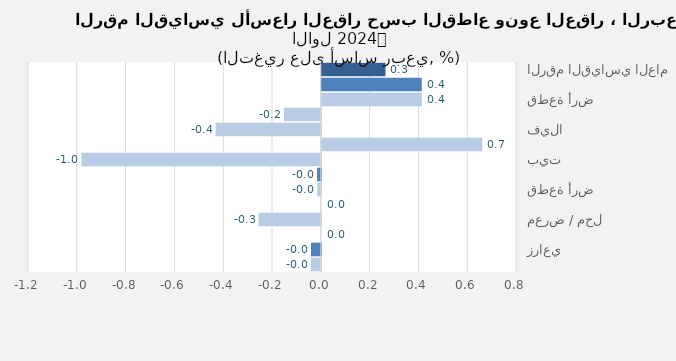
| Category | Series 0 |
|---|---|
| الرقم القياسي العام | 0.261 |
| سكني | 0.41 |
| قطعة أرض | 0.41 |
| عمارة | -0.151 |
| فيلا | -0.431 |
| شقة | 0.658 |
| بيت | -0.981 |
| تجاري | -0.015 |
| قطعة أرض | -0.014 |
| عمارة | 0 |
| معرض / محل | -0.255 |
| مركز تجاري | 0 |
| زراعي | -0.04 |
| أرض زراعية | -0.04 |